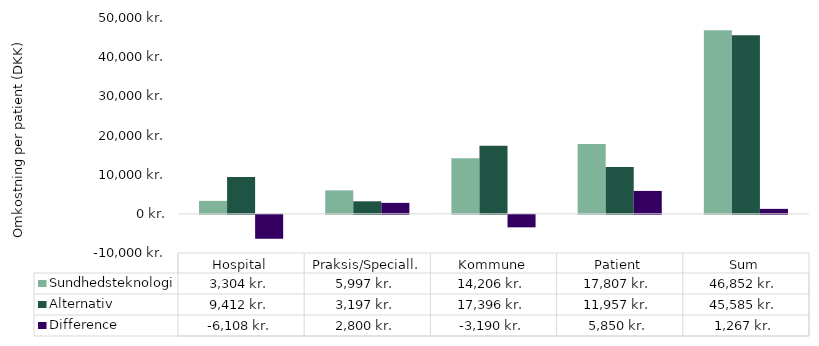
| Category | Sundhedsteknologi | Alternativ  | Difference |
|---|---|---|---|
| Hospital | 3304.417 | 9411.917 | -6107.5 |
| Praksis/Speciall. | 5997.46 | 3197.46 | 2800 |
| Kommune | 14205.72 | 17395.75 | -3190.03 |
| Patient | 17807 | 11957 | 5850 |
| Sum | 46851.631 | 45584.627 | 1267.004 |